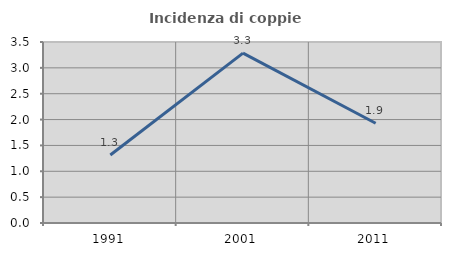
| Category | Incidenza di coppie miste |
|---|---|
| 1991.0 | 1.316 |
| 2001.0 | 3.285 |
| 2011.0 | 1.929 |